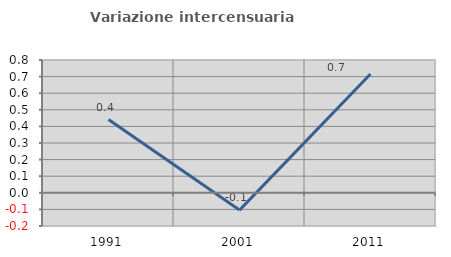
| Category | Variazione intercensuaria annua |
|---|---|
| 1991.0 | 0.441 |
| 2001.0 | -0.104 |
| 2011.0 | 0.715 |